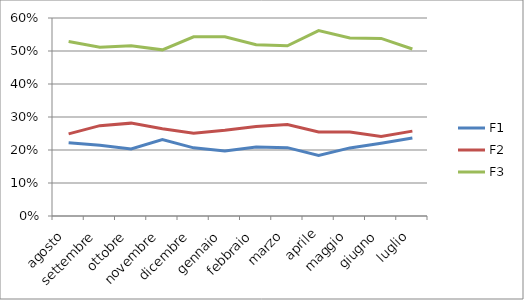
| Category | F1 | F2 | F3 |
|---|---|---|---|
| agosto | 0.222 | 0.249 | 0.529 |
| settembre | 0.215 | 0.274 | 0.512 |
| ottobre | 0.203 | 0.281 | 0.516 |
| novembre | 0.232 | 0.265 | 0.504 |
| dicembre | 0.207 | 0.25 | 0.543 |
| gennaio | 0.197 | 0.26 | 0.543 |
| febbraio | 0.209 | 0.271 | 0.519 |
| marzo | 0.207 | 0.277 | 0.516 |
| aprile | 0.184 | 0.254 | 0.562 |
| maggio | 0.206 | 0.254 | 0.539 |
| giugno | 0.221 | 0.241 | 0.538 |
| luglio | 0.237 | 0.257 | 0.506 |